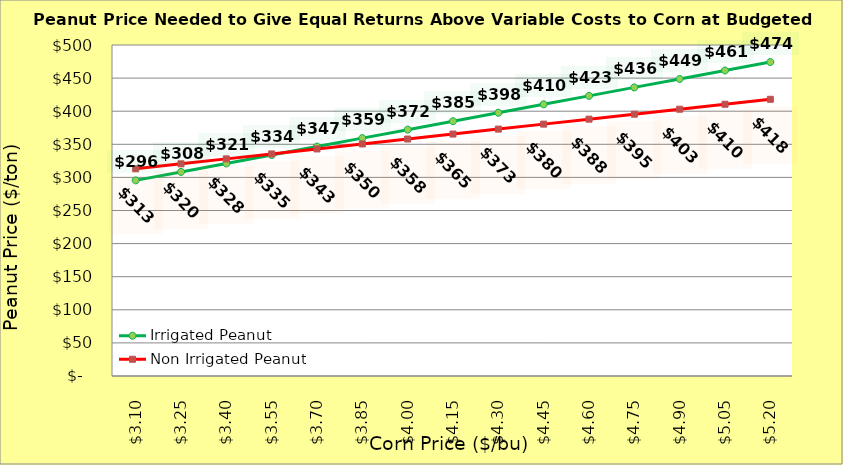
| Category | Irrigated Peanut | Non Irrigated Peanut |
|---|---|---|
| 3.1000000000000005 | 295.526 | 312.982 |
| 3.2500000000000004 | 308.292 | 320.482 |
| 3.4000000000000004 | 321.058 | 327.982 |
| 3.5500000000000003 | 333.823 | 335.482 |
| 3.7 | 346.589 | 342.982 |
| 3.85 | 359.355 | 350.482 |
| 4.0 | 372.121 | 357.982 |
| 4.15 | 384.887 | 365.482 |
| 4.300000000000001 | 397.653 | 372.982 |
| 4.450000000000001 | 410.419 | 380.482 |
| 4.600000000000001 | 423.185 | 387.982 |
| 4.750000000000002 | 435.951 | 395.482 |
| 4.900000000000002 | 448.717 | 402.982 |
| 5.0500000000000025 | 461.483 | 410.482 |
| 5.200000000000003 | 474.249 | 417.982 |